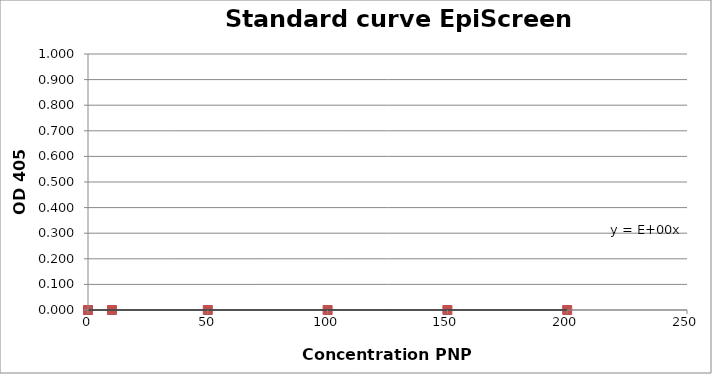
| Category | Series 1 |
|---|---|
| 0.0 | 0 |
| 10.0 | 0 |
| 50.0 | 0 |
| 100.0 | 0 |
| 150.0 | 0 |
| 200.0 | 0 |